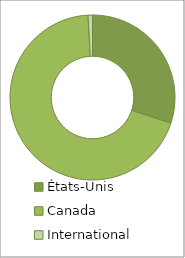
| Category | Series 0 |
|---|---|
| États-Unis | 28118 |
| Canada | 64688 |
| International | 808 |